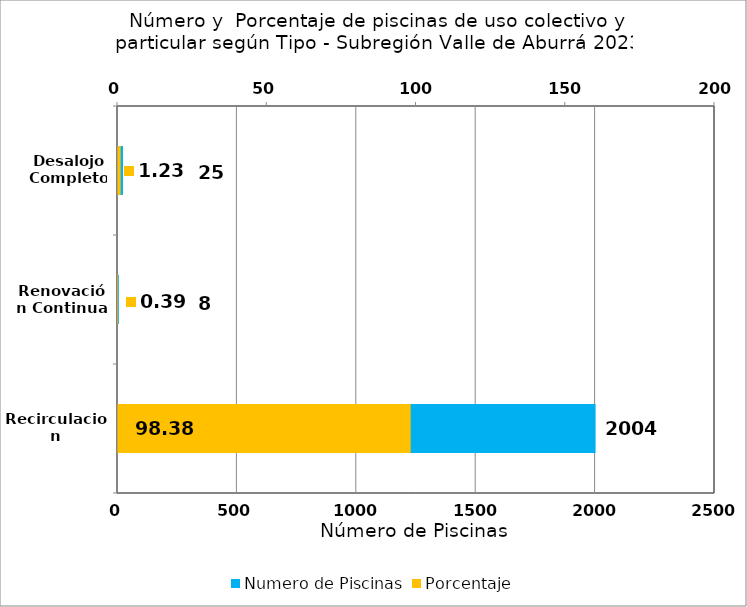
| Category | Numero de Piscinas |
|---|---|
| Recirculacion | 2004 |
| Renovación Continua | 8 |
| Desalojo Completo | 25 |